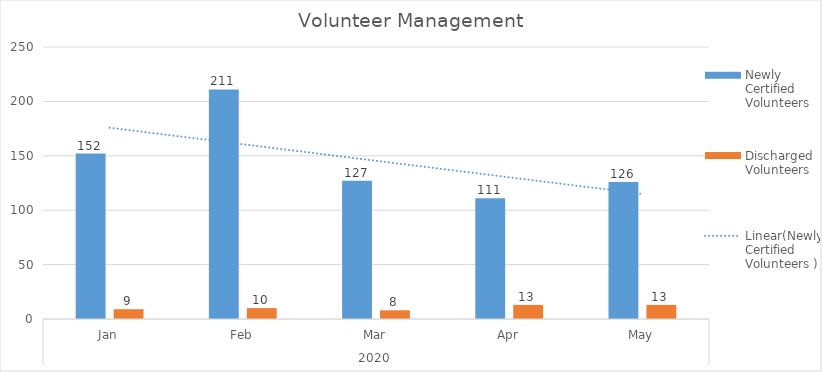
| Category | Newly Certified Volunteers  | Discharged Volunteers  |
|---|---|---|
| 0 | 152 | 9 |
| 1 | 211 | 10 |
| 2 | 127 | 8 |
| 3 | 111 | 13 |
| 4 | 126 | 13 |